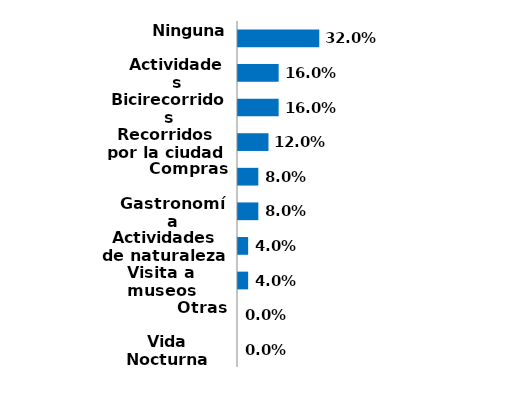
| Category | Series 0 |
|---|---|
| Vida Nocturna | 0 |
| Otras | 0 |
| Visita a museos | 0.04 |
| Actividades de naturaleza | 0.04 |
| Gastronomía | 0.08 |
| Compras | 0.08 |
| Recorridos por la ciudad | 0.12 |
| Bicirecorridos | 0.16 |
| Actividades culturales | 0.16 |
| Ninguna | 0.32 |